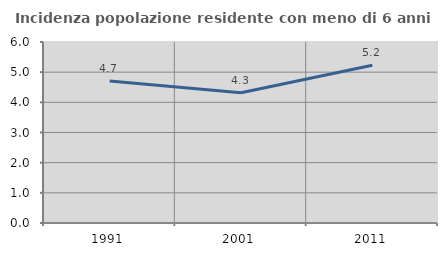
| Category | Incidenza popolazione residente con meno di 6 anni |
|---|---|
| 1991.0 | 4.71 |
| 2001.0 | 4.316 |
| 2011.0 | 5.229 |